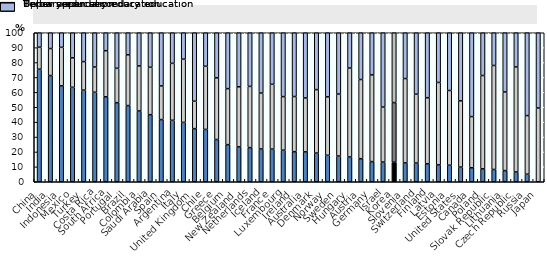
| Category | Below upper secondary education | Upper secondary education | Tertiary education |
|---|---|---|---|
| China | 75.538 | 14.781 | 9.681 |
| India | 71.298 | 18.107 | 10.595 |
| Indonesia | 64.372 | 25.861 | 9.767 |
| Mexico | 63.365 | 19.816 | 16.819 |
| Turkey | 61.487 | 19.151 | 19.363 |
| Costa Rica | 60.063 | 16.938 | 22.999 |
| South Africa | 57.02 | 30.943 | 12.038 |
| Portugal | 53.091 | 23.061 | 23.847 |
| Brazil | 51.127 | 34.078 | 14.795 |
| Colombia | 47.524 | 30.229 | 22.247 |
| Saudi Arabia | 45.034 | 31.804 | 23.162 |
| Spain | 41.726 | 22.58 | 35.693 |
| Argentina | 41.248 | 38.217 | 20.535 |
| Italy | 39.857 | 42.42 | 17.724 |
| United Kingdom | 35.653 | 18.385 | 45.961 |
| Chile | 35.134 | 42.391 | 22.475 |
| Greece | 28.35 | 41.419 | 30.232 |
| Belgium | 24.906 | 37.59 | 37.504 |
| New Zealand | 23.423 | 40.301 | 36.275 |
| Netherlands | 22.933 | 41.068 | 35.999 |
| Iceland | 22.002 | 37.523 | 40.475 |
| France | 21.892 | 43.526 | 34.582 |
| Luxembourg | 21.181 | 35.963 | 42.856 |
| Ireland | 20.183 | 37.011 | 42.806 |
| Australia | 20.067 | 36.189 | 43.744 |
| Denmark | 19.254 | 42.577 | 38.169 |
| Norway | 17.761 | 39.222 | 43.017 |
| Sweden | 17.272 | 41.588 | 41.139 |
| Hungary | 16.638 | 59.649 | 23.713 |
| Austria | 15.472 | 53.144 | 31.384 |
| Germany | 13.524 | 58.185 | 28.292 |
| Israel | 13.231 | 36.873 | 49.895 |
| Korea | 13.122 | 40.019 | 46.859 |
| Slovenia | 12.655 | 56.609 | 30.736 |
| Switzerland | 12.564 | 46.2 | 41.235 |
| Finland | 12.092 | 44.313 | 43.595 |
| Latvia | 11.318 | 55.32 | 33.361 |
| Estonia | 11.104 | 50.139 | 38.757 |
| United States | 9.853 | 44.481 | 45.666 |
| Canada | 9.391 | 34.344 | 56.265 |
| Poland | 8.679 | 62.61 | 28.711 |
| Slovak Republic | 8.251 | 69.77 | 21.98 |
| Lithuania | 7.484 | 52.783 | 39.733 |
| Czech Republic | 6.573 | 70.455 | 22.972 |
| Russia | 5.055 | 39.349 | 55.596 |
| Japan | 0 | 49.503 | 50.497 |